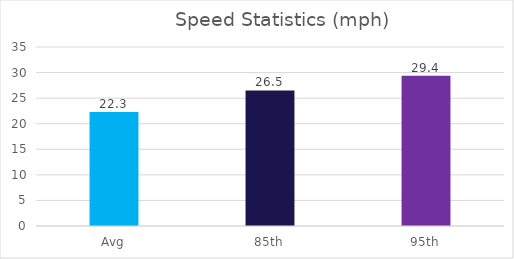
| Category | Series 0 |
|---|---|
| Avg | 22.3 |
| 85th | 26.5 |
| 95th | 29.4 |